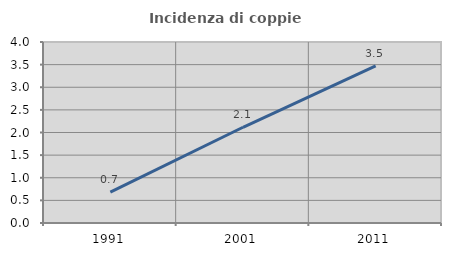
| Category | Incidenza di coppie miste |
|---|---|
| 1991.0 | 0.684 |
| 2001.0 | 2.116 |
| 2011.0 | 3.471 |